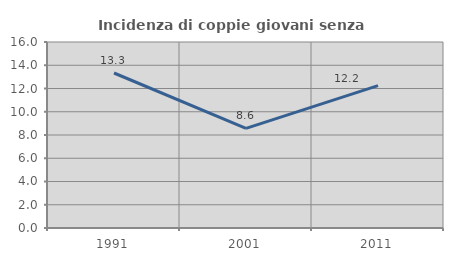
| Category | Incidenza di coppie giovani senza figli |
|---|---|
| 1991.0 | 13.333 |
| 2001.0 | 8.571 |
| 2011.0 | 12.245 |